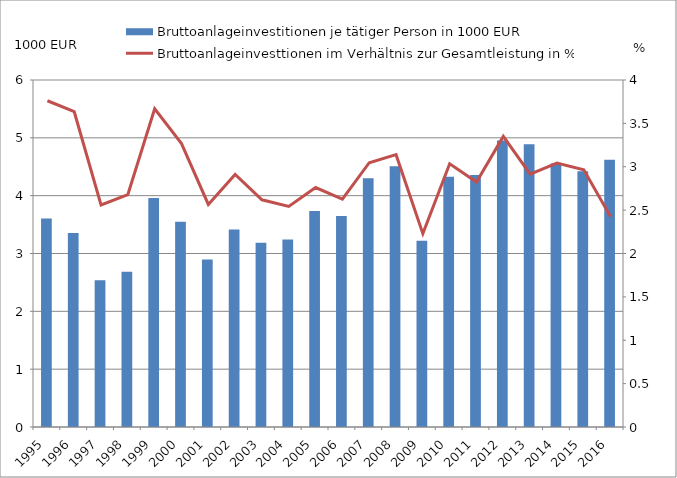
| Category | Bruttoanlageinvestitionen je tätiger Person in 1000 EUR |
|---|---|
| 1995.0 | 3.607 |
| 1996.0 | 3.355 |
| 1997.0 | 2.538 |
| 1998.0 | 2.683 |
| 1999.0 | 3.96 |
| 2000.0 | 3.549 |
| 2001.0 | 2.897 |
| 2002.0 | 3.414 |
| 2003.0 | 3.186 |
| 2004.0 | 3.244 |
| 2005.0 | 3.734 |
| 2006.0 | 3.649 |
| 2007.0 | 4.3 |
| 2008.0 | 4.51 |
| 2009.0 | 3.22 |
| 2010.0 | 4.327 |
| 2011.0 | 4.357 |
| 2012.0 | 4.955 |
| 2013.0 | 4.887 |
| 2014.0 | 4.555 |
| 2015.0 | 4.422 |
| 2016.0 | 4.62 |